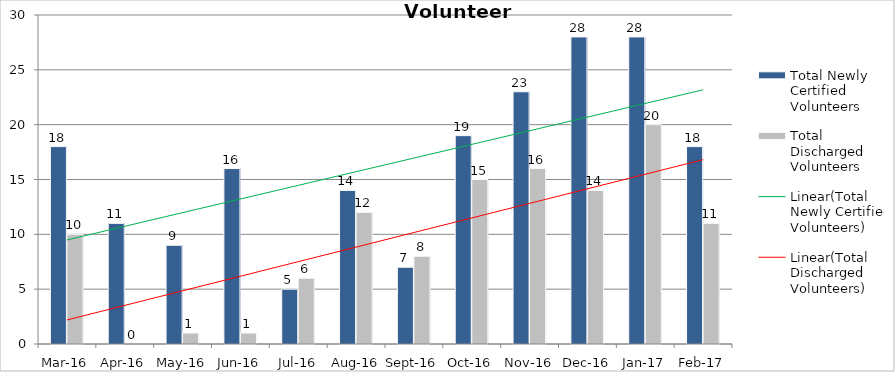
| Category | Total Newly Certified Volunteers | Total Discharged Volunteers |
|---|---|---|
| Mar-16 | 18 | 10 |
| Apr-16 | 11 | 0 |
| May-16 | 9 | 1 |
| Jun-16 | 16 | 1 |
| Jul-16 | 5 | 6 |
| Aug-16 | 14 | 12 |
| Sep-16 | 7 | 8 |
| Oct-16 | 19 | 15 |
| Nov-16 | 23 | 16 |
| Dec-16 | 28 | 14 |
| Jan-17 | 28 | 20 |
| Feb-17 | 18 | 11 |